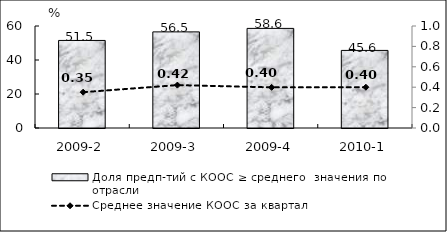
| Category | Доля предп-тий с КООС ≥ среднего  значения по отрасли |
|---|---|
| 2009-2 | 51.5 |
| 2009-3 | 56.54 |
| 2009-4 | 58.59 |
| 2010-1 | 45.64 |